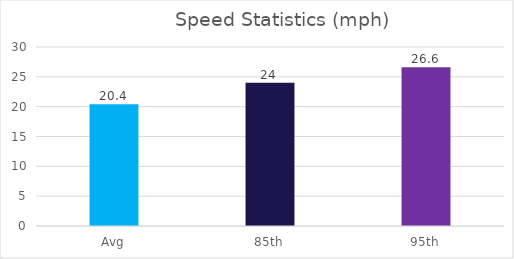
| Category | Series 0 |
|---|---|
| Avg | 20.4 |
| 85th | 24 |
| 95th | 26.6 |